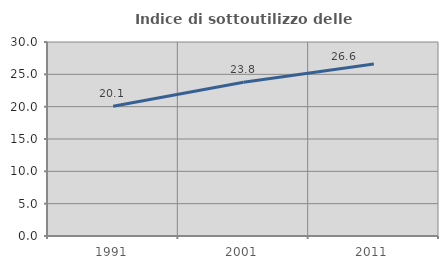
| Category | Indice di sottoutilizzo delle abitazioni  |
|---|---|
| 1991.0 | 20.059 |
| 2001.0 | 23.78 |
| 2011.0 | 26.607 |